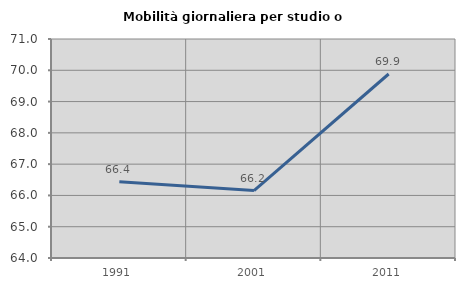
| Category | Mobilità giornaliera per studio o lavoro |
|---|---|
| 1991.0 | 66.441 |
| 2001.0 | 66.157 |
| 2011.0 | 69.881 |